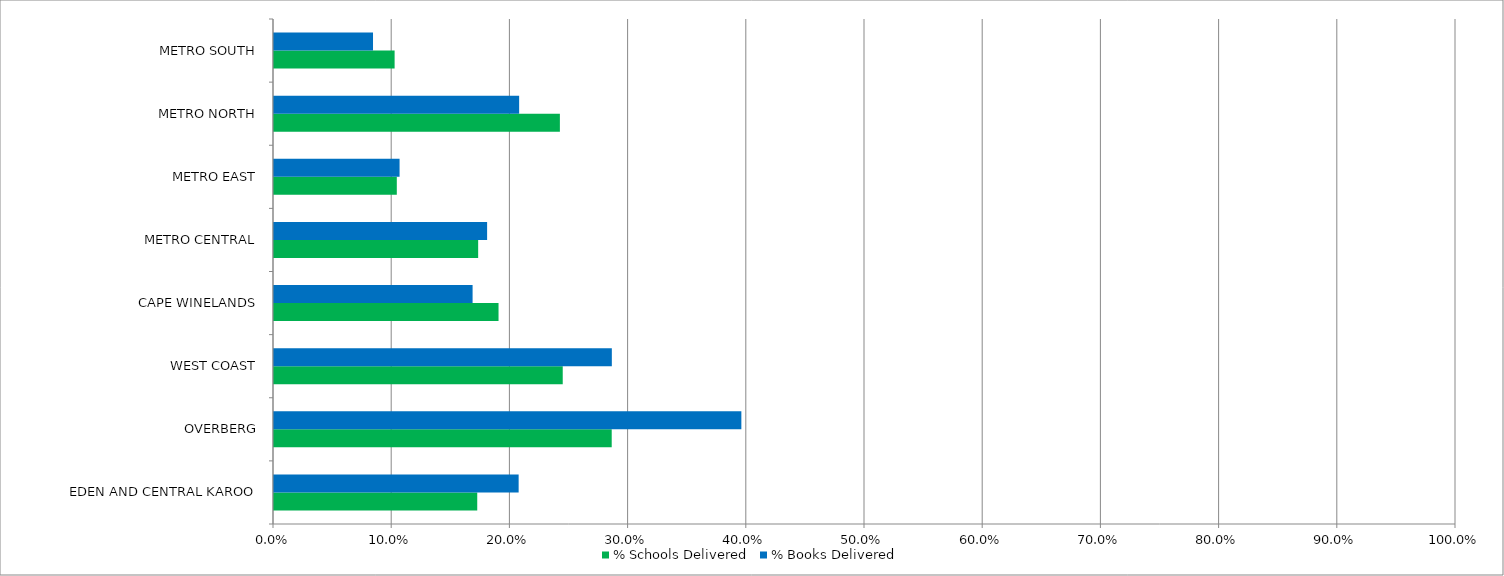
| Category | % Schools Delivered | % Books Delivered |
|---|---|---|
| EDEN AND CENTRAL KAROO | 0.172 | 0.207 |
| OVERBERG | 0.286 | 0.395 |
| WEST COAST | 0.244 | 0.286 |
| CAPE WINELANDS | 0.19 | 0.168 |
| METRO CENTRAL | 0.173 | 0.18 |
| METRO EAST | 0.104 | 0.106 |
| METRO NORTH | 0.242 | 0.207 |
| METRO SOUTH | 0.102 | 0.084 |